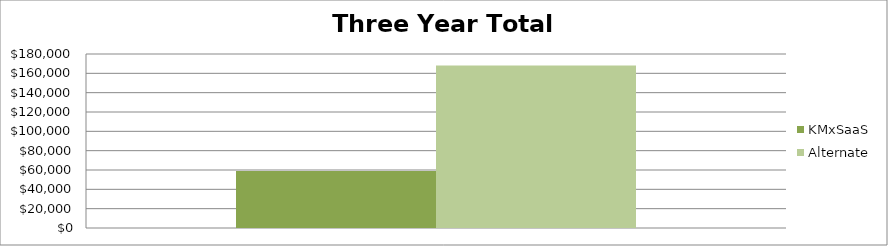
| Category | KMxSaaS | Alternate |
|---|---|---|
| 0 | 59000 | 168000 |